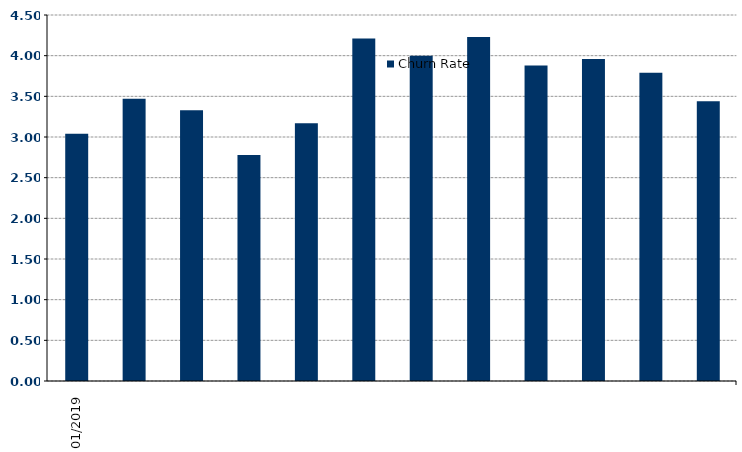
| Category | Churn Rate |
|---|---|
| 2019-01-01 | 3.04 |
| 2019-02-01 | 3.47 |
| 2019-03-01 | 3.33 |
| 2019-04-01 | 2.78 |
| 2019-05-01 | 3.17 |
| 2019-06-01 | 4.21 |
| 2019-07-01 | 4 |
| 2019-08-01 | 4.23 |
| 2019-09-01 | 3.88 |
| 2019-10-01 | 3.96 |
| 2019-11-01 | 3.79 |
| 2019-12-01 | 3.44 |